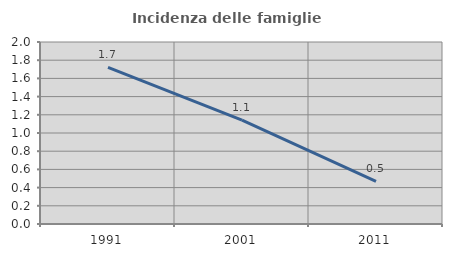
| Category | Incidenza delle famiglie numerose |
|---|---|
| 1991.0 | 1.72 |
| 2001.0 | 1.142 |
| 2011.0 | 0.469 |